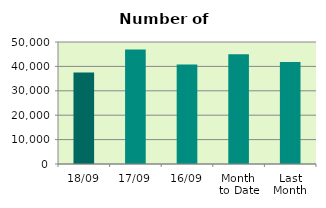
| Category | Series 0 |
|---|---|
| 18/09 | 37470 |
| 17/09 | 46934 |
| 16/09 | 40824 |
| Month 
to Date | 44952.769 |
| Last
Month | 41849.545 |